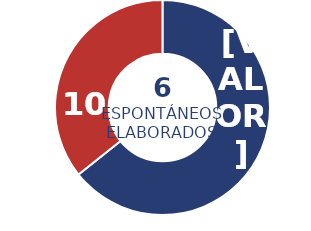
| Category | Series 0 |
|---|---|
| Física | 9 |
| Jurídica | 5 |